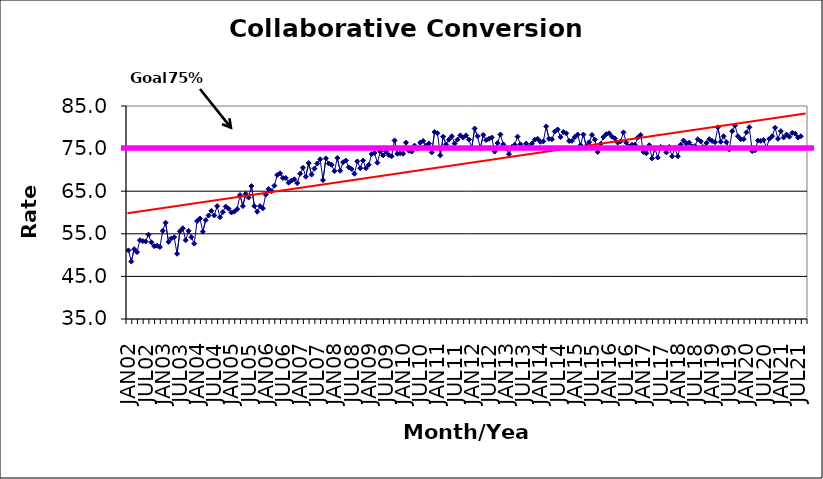
| Category | Series 0 |
|---|---|
| JAN02 | 51.1 |
| FEB02 | 48.5 |
| MAR02 | 51.4 |
| APR02 | 50.7 |
| MAY02 | 53.5 |
| JUN02 | 53.3 |
| JUL02 | 53.2 |
| AUG02 | 54.8 |
| SEP02 | 53 |
| OCT02 | 52.1 |
| NOV02 | 52.2 |
| DEC02 | 51.9 |
| JAN03 | 55.7 |
| FEB03 | 57.6 |
| MAR03 | 53.1 |
| APR03 | 53.9 |
| MAY03 | 54.2 |
| JUN03 | 50.3 |
| JUL03 | 55.6 |
| AUG03 | 56.3 |
| SEP03 | 53.5 |
| OCT03 | 55.7 |
| NOV03 | 54.2 |
| DEC03 | 52.7 |
| JAN04 | 58 |
| FEB04 | 58.6 |
| MAR04 | 55.5 |
| APR04 | 58.2 |
| MAY04 | 59.3 |
| JUN04 | 60.4 |
| JUL04 | 59.3 |
| AUG04 | 61.5 |
| SEP04 | 58.9 |
| OCT04 | 60.1 |
| NOV04 | 61.4 |
| DEC04 | 60.9 |
| JAN05 | 60 |
| FEB05 | 60.2 |
| MAR05 | 60.8 |
| APR05 | 64.1 |
| MAY05 | 61.5 |
| JUN05 | 64.4 |
| JUL05 | 63.5 |
| AUG05 | 66.2 |
| SEP05 | 61.5 |
| OCT05 | 60.2 |
| NOV05 | 61.5 |
| DEC05 | 61 |
| JAN06 | 64.2 |
| FEB06 | 65.5 |
| MAR06 | 65 |
| APR06 | 66.3 |
| MAY06 | 68.8 |
| JUN06 | 69.2 |
| JUL06 | 68.1 |
| AUG06 | 68.1 |
| SEP06 | 67 |
| OCT06 | 67.5 |
| NOV06 | 67.8 |
| DEC06 | 66.9 |
| JAN07 | 69.1 |
| FEB07 | 70.5 |
| MAR07 | 68.4 |
| APR07 | 71.6 |
| MAY07 | 68.9 |
| JUN07 | 70.3 |
| JUL07 | 71.5 |
| AUG07 | 72.5 |
| SEP07 | 67.6 |
| OCT07 | 72.7 |
| NOV07 | 71.5 |
| DEC07 | 71.2 |
| JAN08 | 69.7 |
| FEB08 | 72.8 |
| MAR08 | 69.8 |
| APR08 | 71.8 |
| MAY08 | 72.2 |
| JUN08 | 70.6 |
| JUL08 | 70.2 |
| AUG08 | 69.1 |
| SEP08 | 72 |
| OCT08 | 70.4 |
| NOV08 | 72.2 |
| DEC08 | 70.4 |
| JAN09 | 71.2 |
| FEB09 | 73.7 |
| MAR09 | 74 |
| APR09 | 71.7 |
| MAY09 | 74.3 |
| JUN09 | 73.4 |
| JUL09 | 74.3 |
| AUG09 | 73.5 |
| SEP09 | 73.2 |
| OCT09 | 76.9 |
| NOV09 | 73.8 |
| DEC09 | 73.9 |
| JAN10 | 73.8 |
| FEB10 | 76.4 |
| MAR10 | 74.5 |
| APR10 | 74.3 |
| MAY10 | 75.7 |
| JUN10 | 75 |
| JUL10 | 76.4 |
| AUG10 | 76.8 |
| SEP10 | 75.7 |
| OCT10 | 76.2 |
| NOV10 | 74.1 |
| DEC10 | 78.9 |
| JAN11 | 78.6 |
| FEB11 | 73.4 |
| MAR11 | 77.8 |
| APR11 | 76 |
| MAY11 | 77.1 |
| JUN11 | 77.9 |
| JUL11 | 76.2 |
| AUG11 | 77.1 |
| SEP11 | 78.1 |
| OCT11 | 77.6 |
| NOV11 | 78.1 |
| DEC11 | 77.1 |
| JAN12 | 75.2 |
| FEB12 | 79.7 |
| MAR12 | 77.9 |
| APR12 | 75.1 |
| MAY12 | 78.2 |
| JUN12 | 77 |
| JUL12 | 77.3 |
| AUG12 | 77.6 |
| SEP12 | 74.3 |
| OCT12 | 76.3 |
| NOV12 | 78.3 |
| DEC12 | 76 |
| JAN13 | 75.1 |
| FEB13 | 73.7 |
| MAR13 | 75.4 |
| APR13 | 75.9 |
| MAY13 | 77.8 |
| JUN13 | 76 |
| JUL13 | 75.1 |
| AUG13 | 76.2 |
| SEP13 | 75.4 |
| OCT13 | 76.2 |
| NOV13 | 77.1 |
| DEC13 | 77.3 |
| JAN14 | 76.6 |
| FEB14 | 76.7 |
| MAR14 | 80.2 |
| APR14 | 77.3 |
| MAY14 | 77.2 |
| JUN14 | 79 |
| JUL14 | 79.5 |
| AUG14 | 77.7 |
| SEP14 | 78.9 |
| OCT14 | 78.6 |
| NOV14 | 76.8 |
| DEC14 | 76.8 |
| JAN15 | 77.7 |
| FEB15 | 78.3 |
| MAR15 | 75.8 |
| APR15 | 78.3 |
| MAY15 | 75.6 |
| JUN15 | 76.5 |
| JUL15 | 78.2 |
| AUG15 | 77.1 |
| SEP15 | 74.2 |
| OCT15 | 76.1 |
| NOV15 | 77.7 |
| DEC15 | 78.4 |
| JAN16 | 78.6 |
| FEB16 | 77.8 |
| MAR16 | 77.4 |
| APR16 | 76.4 |
| MAY16 | 76.7 |
| JUN16 | 78.8 |
| JUL16 | 76.4 |
| AUG16 | 75.5 |
| SEP16 | 75.9 |
| OCT16 | 75.9 |
| NOV16 | 77.6 |
| DEC16 | 78.2 |
| JAN17 | 74.2 |
| FEB17 | 73.9 |
| MAR17 | 75.8 |
| APR17 | 72.7 |
| MAY17 | 75 |
| JUN17 | 72.9 |
| JUL17 | 75.4 |
| AUG17 | 75.2 |
| SEP17 | 74.1 |
| OCT17 | 75.4 |
| NOV17 | 73.2 |
| DEC17 | 75.2 |
| JAN18 | 73.2 |
| FEB18 | 75.9 |
| MAR18 | 76.9 |
| APR18 | 76.2 |
| MAY18 | 76.4 |
| JUN18 | 75.5 |
| JUL18 | 75.6 |
| AUG18 | 77.2 |
| SEP18 | 76.7 |
| OCT18 | 75.3 |
| NOV18 | 76.3 |
| DEC18 | 77.2 |
| JAN19 | 76.8 |
| FEB19 | 76.5 |
| MAR19 | 80 |
| APR19 | 76.6 |
| MAY19 | 77.9 |
| JUN19 | 76.5 |
| JUL19 | 74.8 |
| AUG19 | 79.1 |
| SEP19 | 80.4 |
| OCT19 | 77.9 |
| NOV19 | 77.2 |
| DEC19 | 77.2 |
| JAN20 | 78.8 |
| FEB20 | 80 |
| MAR20 | 74.4 |
| APR20 | 74.6 |
| MAY20 | 76.9 |
| JUN20 | 76.8 |
| JUL20 | 77 |
| AUG20 | 75.2 |
| SEP20 | 77.3 |
| OCT20 | 77.9 |
| NOV20 | 79.9 |
| DEC20 | 77.3 |
| JAN21 | 79.1 |
| FEB21 | 77.6 |
| MAR21 | 78.3 |
| APR21 | 77.8 |
| MAY21 | 78.7 |
| JUN21 | 78.5 |
| JUL21 | 77.6 |
| AUG21 | 77.9 |